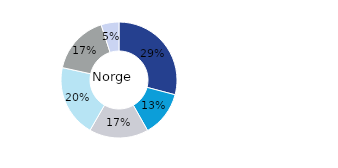
| Category | Norge |
|---|---|
| Kontor | 0.291 |
| Bostäder | 0.127 |
| Handel | 0.165 |
| Logistik* | 0.201 |
| Samhällsfastigheter | 0.166 |
| Övrigt | 0.05 |